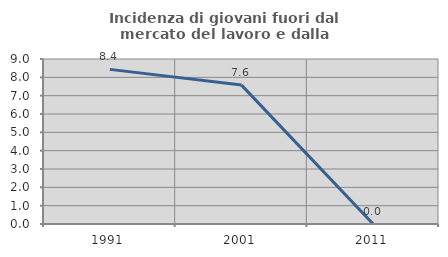
| Category | Incidenza di giovani fuori dal mercato del lavoro e dalla formazione  |
|---|---|
| 1991.0 | 8.434 |
| 2001.0 | 7.576 |
| 2011.0 | 0 |